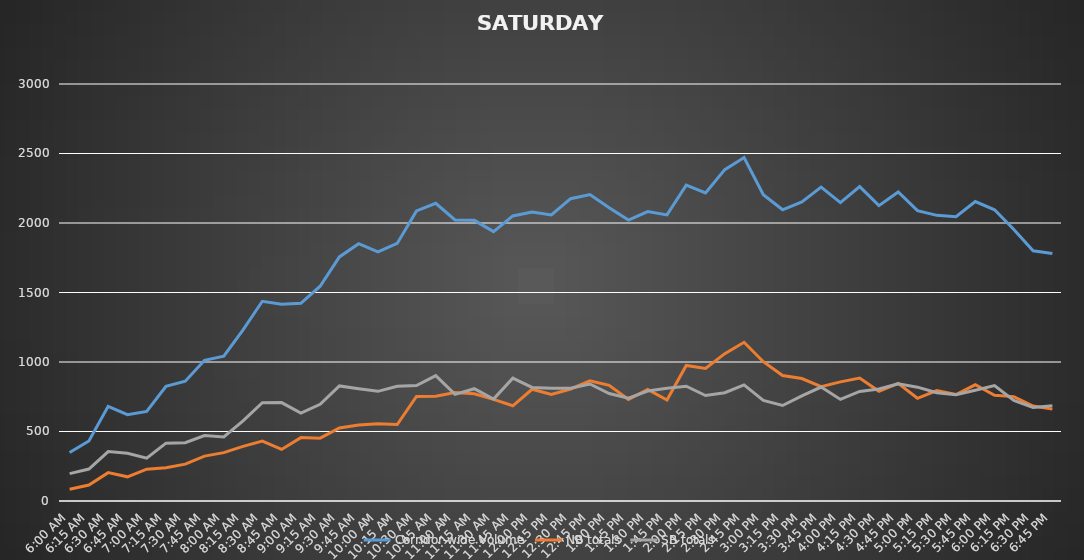
| Category | Corridor-wide Volume | NB totals | SB totals |
|---|---|---|---|
| 6:00 AM | 349 | 85 | 197 |
| 6:15 AM | 432 | 115 | 230 |
| 6:30 AM | 681 | 204 | 356 |
| 6:45 AM | 621 | 174 | 343 |
| 7:00 AM | 644 | 229 | 308 |
| 7:15 AM | 825 | 240 | 416 |
| 7:30 AM | 862 | 265 | 419 |
| 7:45 AM | 1012 | 323 | 471 |
| 8:00 AM | 1042 | 348 | 461 |
| 8:15 AM | 1231 | 393 | 576 |
| 8:30 AM | 1437 | 431 | 707 |
| 8:45 AM | 1415 | 371 | 708 |
| 9:00 AM | 1422 | 456 | 632 |
| 9:15 AM | 1545 | 452 | 696 |
| 9:30 AM | 1756 | 525 | 828 |
| 9:45 AM | 1851 | 546 | 807 |
| 10:00 AM | 1792 | 555 | 789 |
| 10:15 AM | 1853 | 550 | 825 |
| 10:30 AM | 2087 | 752 | 831 |
| 10:45 AM | 2142 | 753 | 902 |
| 11:00 AM | 2022 | 780 | 767 |
| 11:15 AM | 2019 | 771 | 808 |
| 11:30 AM | 1938 | 731 | 733 |
| 11:45 AM | 2051 | 685 | 884 |
| 12:00 PM | 2079 | 804 | 817 |
| 12:15 PM | 2058 | 767 | 811 |
| 12:30 PM | 2175 | 806 | 812 |
| 12:45 PM | 2205 | 865 | 842 |
| 1:00 PM | 2109 | 832 | 773 |
| 1:15 PM | 2021 | 730 | 740 |
| 1:30 PM | 2082 | 803 | 791 |
| 1:45 PM | 2058 | 726 | 811 |
| 2:00 PM | 2272 | 975 | 826 |
| 2:15 PM | 2217 | 954 | 759 |
| 2:30 PM | 2384 | 1060 | 779 |
| 2:45 PM | 2471 | 1142 | 835 |
| 3:00 PM | 2203 | 1002 | 724 |
| 3:15 PM | 2095 | 903 | 687 |
| 3:30 PM | 2152 | 881 | 756 |
| 3:45 PM | 2258 | 822 | 820 |
| 4:00 PM | 2147 | 857 | 731 |
| 4:15 PM | 2262 | 885 | 788 |
| 4:30 PM | 2125 | 790 | 806 |
| 4:45 PM | 2223 | 846 | 843 |
| 5:00 PM | 2089 | 739 | 819 |
| 5:15 PM | 2055 | 795 | 779 |
| 5:30 PM | 2045 | 766 | 765 |
| 5:45 PM | 2154 | 836 | 797 |
| 6:00 PM | 2095 | 761 | 830 |
| 6:15 PM | 1953 | 751 | 723 |
| 6:30 PM | 1800 | 683 | 673 |
| 6:45 PM | 1781 | 661 | 686 |